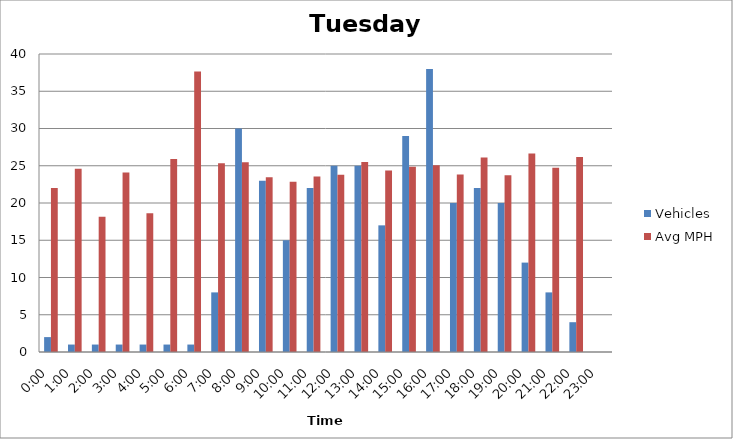
| Category | Vehicles | Avg MPH |
|---|---|---|
| 0:00 | 2 | 22 |
| 1:00 | 1 | 24.59 |
| 2:00 | 1 | 18.15 |
| 3:00 | 1 | 24.08 |
| 4:00 | 1 | 18.64 |
| 5:00 | 1 | 25.91 |
| 6:00 | 1 | 37.64 |
| 7:00 | 8 | 25.35 |
| 8:00 | 30 | 25.46 |
| 9:00 | 23 | 23.46 |
| 10:00 | 15 | 22.86 |
| 11:00 | 22 | 23.55 |
| 12:00 | 25 | 23.79 |
| 13:00 | 25 | 25.49 |
| 14:00 | 17 | 24.36 |
| 15:00 | 29 | 24.87 |
| 16:00 | 38 | 25.08 |
| 17:00 | 20 | 23.82 |
| 18:00 | 22 | 26.1 |
| 19:00 | 20 | 23.74 |
| 20:00 | 12 | 26.64 |
| 21:00 | 8 | 24.74 |
| 22:00 | 4 | 26.16 |
| 23:00 | 0 | 0 |